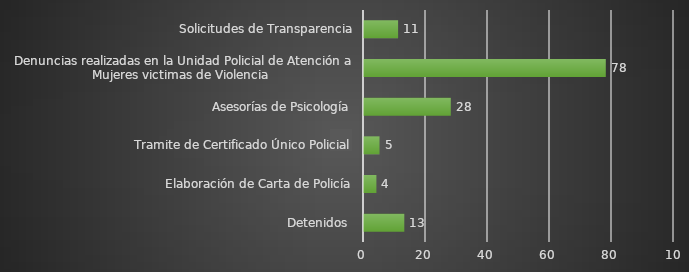
| Category | INDICADOR  |
|---|---|
| Detenidos  | 13 |
| Elaboración de Carta de Policía | 4 |
| Tramite de Certificado Único Policial | 5 |
| Asesorías de Psicología | 28 |
| Denuncias realizadas en la Unidad Policial de Atención a Mujeres victimas de Violencia  | 78 |
| Solicitudes de Transparencia | 11 |